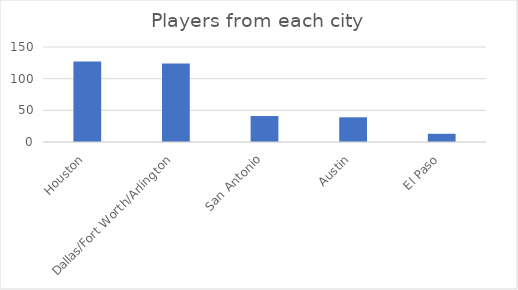
| Category | Series 0 |
|---|---|
| Houston | 127 |
| Dallas/Fort Worth/Arlington | 124 |
| San Antonio | 41 |
| Austin | 39 |
| El Paso | 13 |